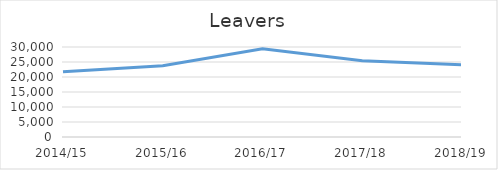
| Category | Leavers |
|---|---|
| 2014/15 | 21790 |
| 2015/16 | 23788 |
| 2016/17 | 29434 |
| 2017/18 | 25400 |
| 2018/19 | 24069 |